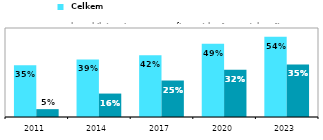
| Category |  Celkem |  k mobilnímu internetu na firemních přenosných zařízeních |
|---|---|---|
| 2011.0 | 0.349 | 0.053 |
| 2014.0 | 0.388 | 0.158 |
| 2017.0 | 0.416 | 0.246 |
| 2020.0 | 0.494 | 0.318 |
| 2023.0 | 0.541 | 0.354 |